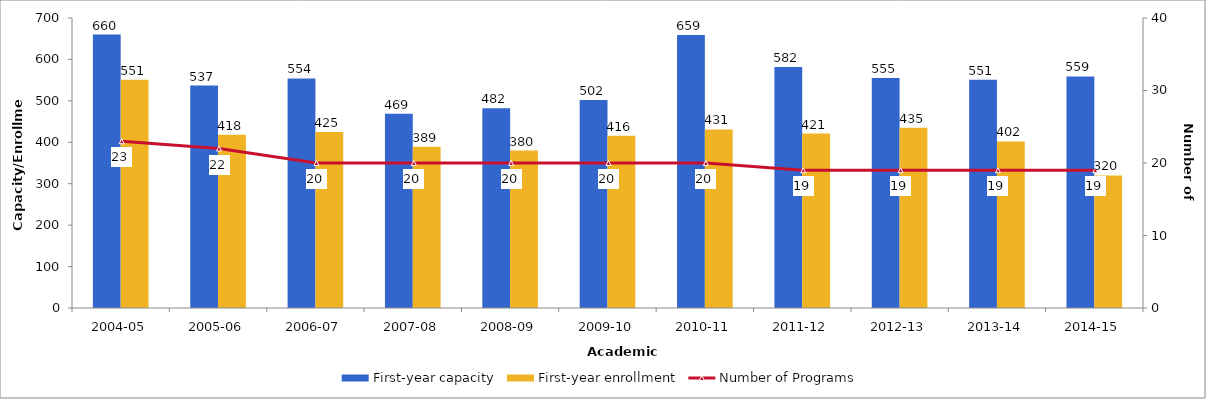
| Category | First-year capacity | First-year enrollment |
|---|---|---|
| 2004-05 | 660 | 551 |
| 2005-06 | 537 | 418 |
| 2006-07 | 554 | 425 |
| 2007-08 | 469 | 389 |
| 2008-09 | 482 | 380 |
| 2009-10 | 502 | 416 |
| 2010-11 | 659 | 431 |
| 2011-12 | 582 | 421 |
| 2012-13 | 555 | 435 |
| 2013-14 | 551 | 402 |
| 2014-15 | 559 | 320 |